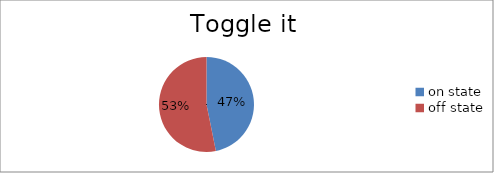
| Category | Toggle State |
|---|---|
| on state | 74 |
| off state | 84 |